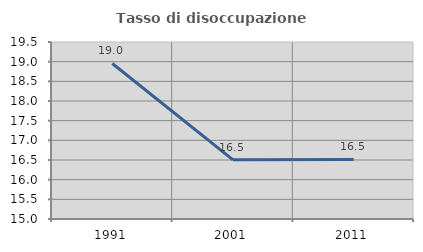
| Category | Tasso di disoccupazione giovanile  |
|---|---|
| 1991.0 | 18.954 |
| 2001.0 | 16.505 |
| 2011.0 | 16.514 |